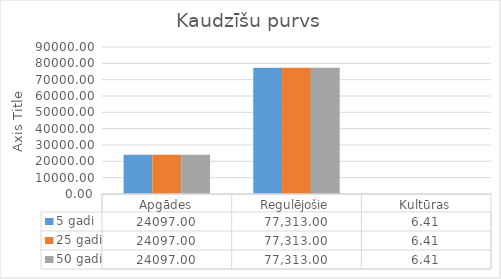
| Category | 5 gadi | 25 gadi | 50 gadi |
|---|---|---|---|
| Apgādes | 24097 | 24097 | 24097 |
| Regulējošie | 77313.003 | 77313.003 | 77313.003 |
| Kultūras | 6.41 | 6.41 | 6.41 |